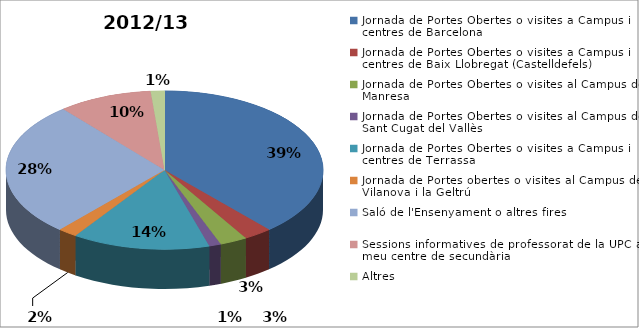
| Category | 2012/13 |
|---|---|
| Jornada de Portes Obertes o visites a Campus i centres de Barcelona | 0.385 |
| Jornada de Portes Obertes o visites a Campus i centres de Baix Llobregat (Castelldefels) | 0.029 |
| Jornada de Portes Obertes o visites al Campus de Manresa | 0.028 |
| Jornada de Portes Obertes o visites al Campus de Sant Cugat del Vallès | 0.012 |
| Jornada de Portes Obertes o visites a Campus i centres de Terrassa | 0.14 |
| Jornada de Portes obertes o visites al Campus de Vilanova i la Geltrú | 0.02 |
| Saló de l'Ensenyament o altres fires | 0.275 |
| Sessions informatives de professorat de la UPC al meu centre de secundària | 0.096 |
| Altres | 0.014 |